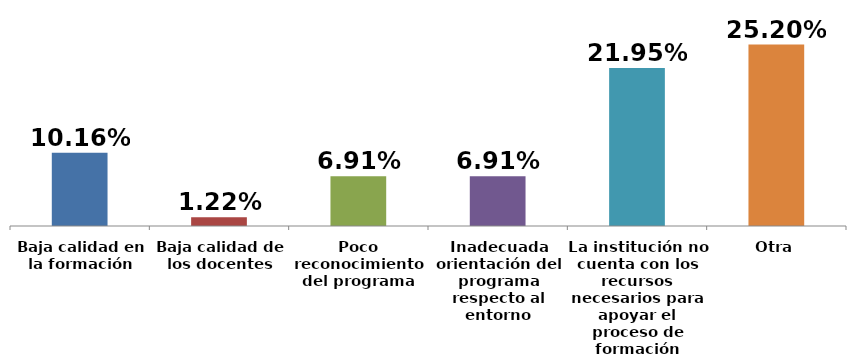
| Category | Series 0 |
|---|---|
| Baja calidad en la formación | 0.102 |
| Baja calidad de los docentes | 0.012 |
| Poco reconocimiento del programa | 0.069 |
| Inadecuada orientación del programa respecto al entorno | 0.069 |
| La institución no cuenta con los recursos necesarios para apoyar el proceso de formación | 0.22 |
| Otra | 0.252 |